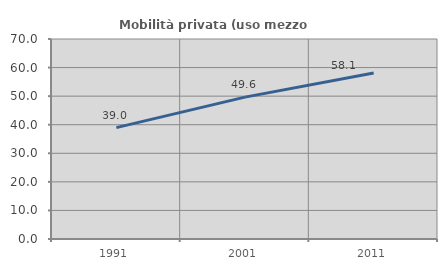
| Category | Mobilità privata (uso mezzo privato) |
|---|---|
| 1991.0 | 38.979 |
| 2001.0 | 49.648 |
| 2011.0 | 58.11 |